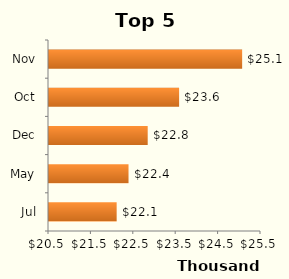
| Category | Final Amount  |
|---|---|
| Jul | 22095.785 |
| May | 22375.569 |
| Dec | 22827.835 |
| Oct | 23568.83 |
| Nov | 25055.399 |